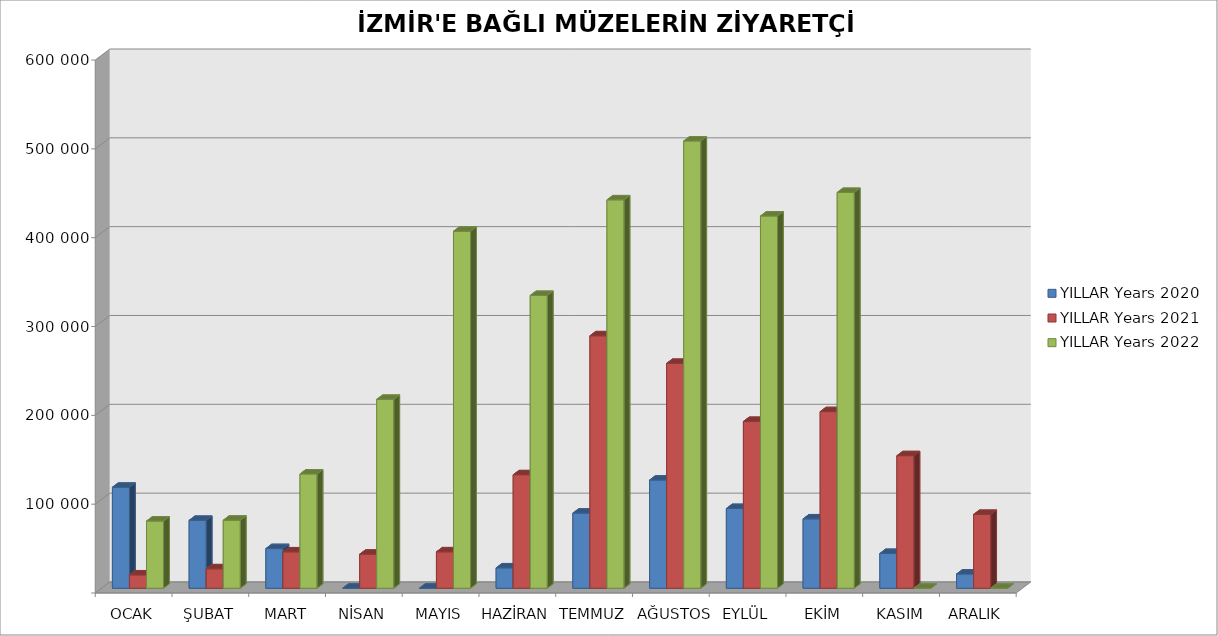
| Category | YILLAR |
|---|---|
| OCAK | 75648 |
| ŞUBAT | 76569 |
| MART | 128664 |
| NİSAN | 212657 |
| MAYIS | 401887 |
| HAZİRAN | 329617 |
| TEMMUZ | 437234 |
| AĞUSTOS | 503510 |
| EYLÜL | 419015 |
| EKİM | 445562 |
| KASIM | 0 |
| ARALIK | 0 |